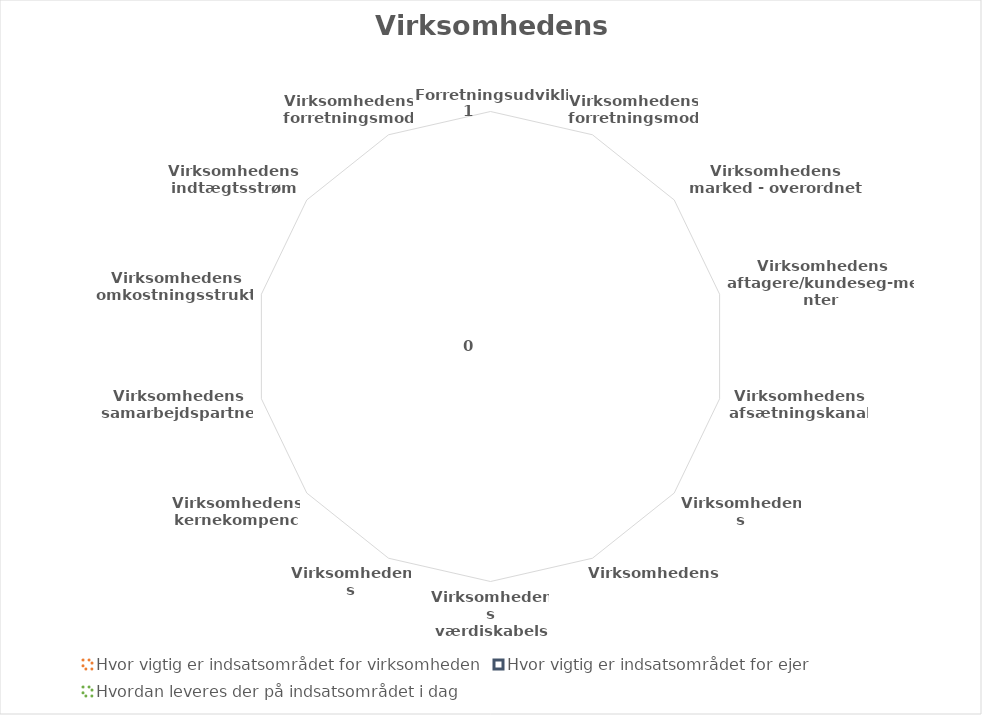
| Category | Hvor vigtig er indsatsområdet for virksomheden | Hvor vigtig er indsatsområdet for ejer | Hvordan leveres der på indsatsområdet i dag |
|---|---|---|---|
| Forretningsudvikling | 0 | 0 | 0 |
| Virksomhedens forretningsmodel | 0 | 0 | 0 |
| Virksomhedens marked - overordnet | 0 | 0 | 0 |
| Virksomhedens aftagere/kundeseg-menter | 0 | 0 | 0 |
| Virksomhedens afsætningskanaler | 0 | 0 | 0 |
| Virksomhedens kunderelationer | 0 | 0 | 0 |
| Virksomhedens produkter | 0 | 0 | 0 |
| Virksomhedens værdiskabelse overordnet | 0 | 0 | 0 |
| Virksomhedens kerneaktiviteter | 0 | 0 | 0 |
| Virksomhedens kernekompencer | 0 | 0 | 0 |
| Virksomhedens samarbejdspartnere | 0 | 0 | 0 |
| Virksomhedens omkostningsstruktur | 0 | 0 | 0 |
| Virksomhedens indtægtsstrømme | 0 | 0 | 0 |
| Virksomhedens forretningsmodel | 0 | 0 | 0 |